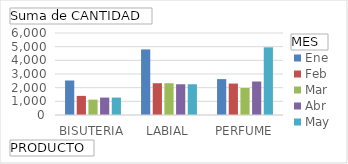
| Category | Ene | Feb | Mar | Abr | May |
|---|---|---|---|---|---|
| BISUTERIA | 2525 | 1400 | 1125 | 1275 | 1275 |
| LABIAL | 4800 | 2325 | 2325 | 2250 | 2250 |
| PERFUME | 2625 | 2300 | 1975 | 2450 | 4950 |